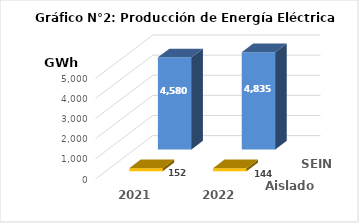
| Category | Aislados | SEIN |
|---|---|---|
| 2021.0 | 151.938 | 4580.244 |
| 2022.0 | 143.622 | 4835.133 |